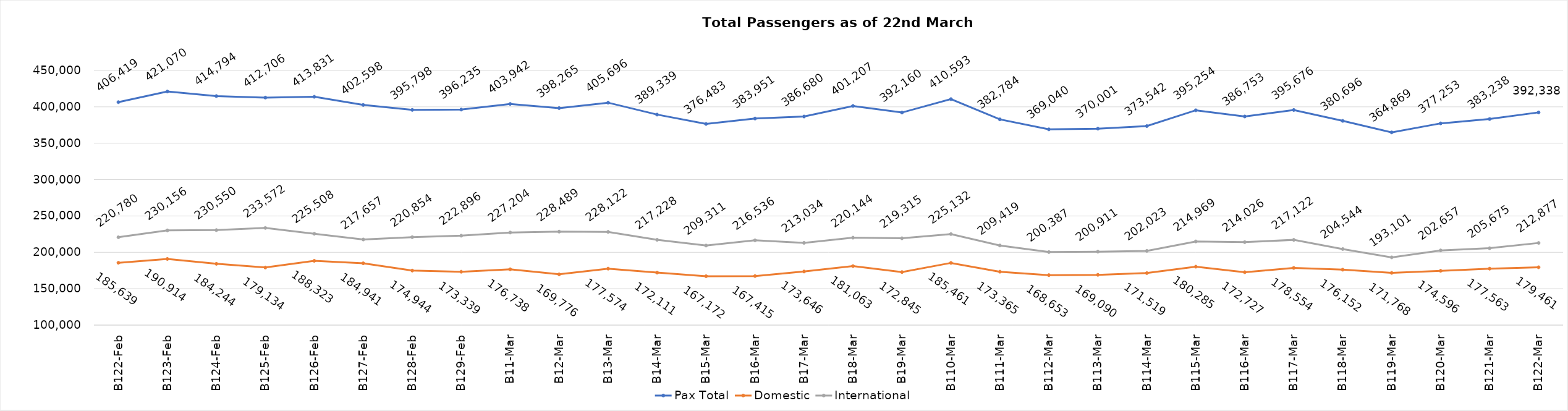
| Category | Pax Total | Domestic | International |
|---|---|---|---|
| 2024-02-22 | 406419 | 185639 | 220780 |
| 2024-02-23 | 421070 | 190914 | 230156 |
| 2024-02-24 | 414794 | 184244 | 230550 |
| 2024-02-25 | 412706 | 179134 | 233572 |
| 2024-02-26 | 413831 | 188323 | 225508 |
| 2024-02-27 | 402598 | 184941 | 217657 |
| 2024-02-28 | 395798 | 174944 | 220854 |
| 2024-02-29 | 396235 | 173339 | 222896 |
| 2024-03-01 | 403942 | 176738 | 227204 |
| 2024-03-02 | 398265 | 169776 | 228489 |
| 2024-03-03 | 405696 | 177574 | 228122 |
| 2024-03-04 | 389339 | 172111 | 217228 |
| 2024-03-05 | 376483 | 167172 | 209311 |
| 2024-03-06 | 383951 | 167415 | 216536 |
| 2024-03-07 | 386680 | 173646 | 213034 |
| 2024-03-08 | 401207 | 181063 | 220144 |
| 2024-03-09 | 392160 | 172845 | 219315 |
| 2024-03-10 | 410593 | 185461 | 225132 |
| 2024-03-11 | 382784 | 173365 | 209419 |
| 2024-03-12 | 369040 | 168653 | 200387 |
| 2024-03-13 | 370001 | 169090 | 200911 |
| 2024-03-14 | 373542 | 171519 | 202023 |
| 2024-03-15 | 395254 | 180285 | 214969 |
| 2024-03-16 | 386753 | 172727 | 214026 |
| 2024-03-17 | 395676 | 178554 | 217122 |
| 2024-03-18 | 380696 | 176152 | 204544 |
| 2024-03-19 | 364869 | 171768 | 193101 |
| 2024-03-20 | 377253 | 174596 | 202657 |
| 2024-03-21 | 383238 | 177563 | 205675 |
| 2024-03-22 | 392338 | 179461 | 212877 |